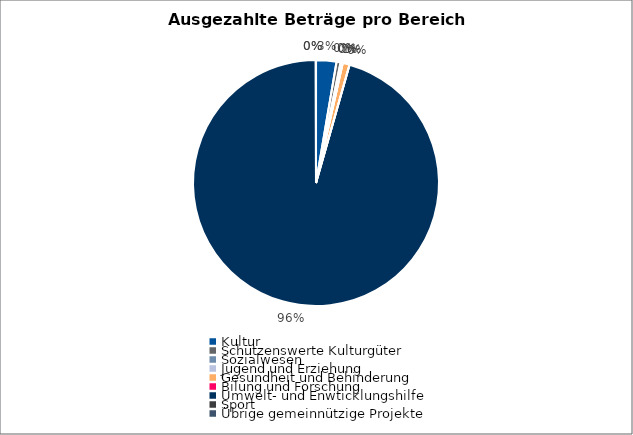
| Category | Series 0 |
|---|---|
| Kultur | 56000 |
| Schützenswerte Kulturgüter | 11000 |
| Sozialwesen | 6000 |
| Jugend und Erziehung | 0 |
| Gesundheit und Behinderung | 19039 |
| Bilung und Forschung | 0 |
| Umwelt- und Enwticklungshilfe | 2001614.09 |
| Sport | 0 |
| Übrige gemeinnützige Projekte | 600 |